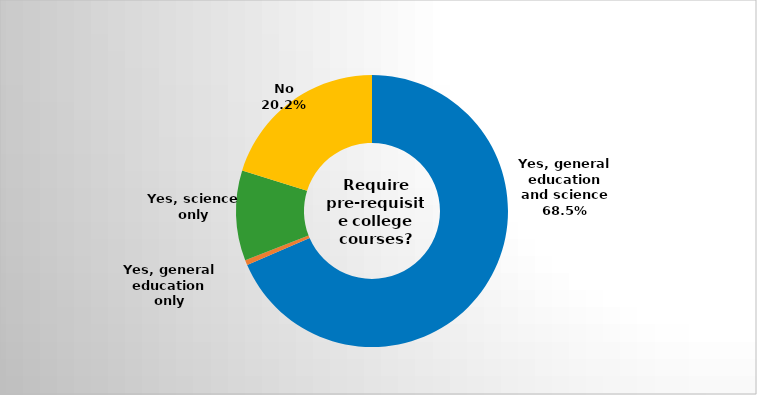
| Category | Series 0 |
|---|---|
| Yes, general education and science | 0.685 |
| Yes, general education only | 0.006 |
| Yes, science only | 0.107 |
| No | 0.202 |